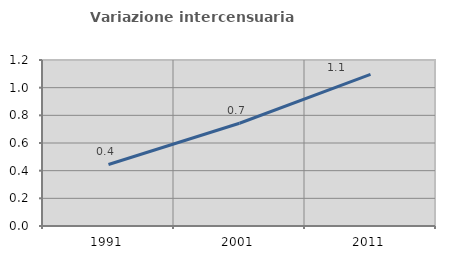
| Category | Variazione intercensuaria annua |
|---|---|
| 1991.0 | 0.445 |
| 2001.0 | 0.743 |
| 2011.0 | 1.095 |